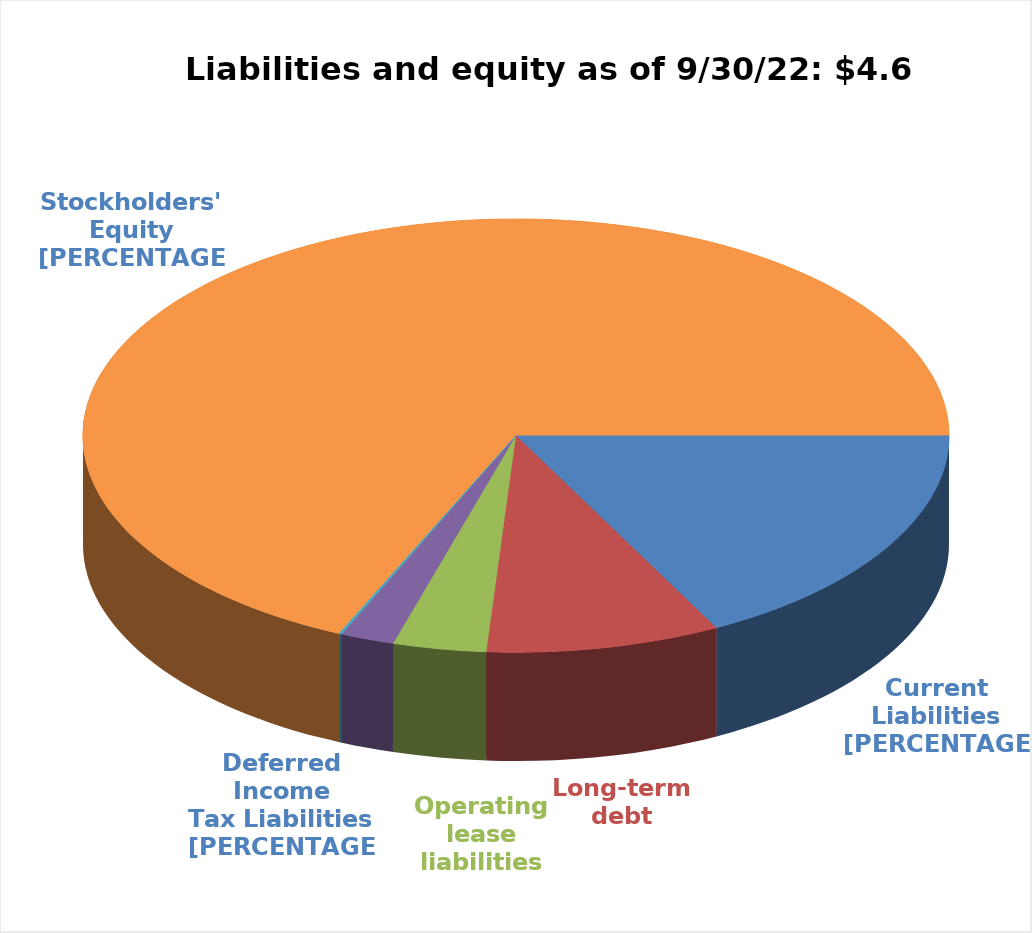
| Category | Series 0 |
|---|---|
| Total current liabilities | 802.6 |
| Long-term debt | 404.7 |
| Operating lease liabilities | 161.2 |
| Deferred income tax liabilities | 92.9 |
| Other long-term liabilities | 4.8 |
| Total stockholders' equity | 3161.2 |